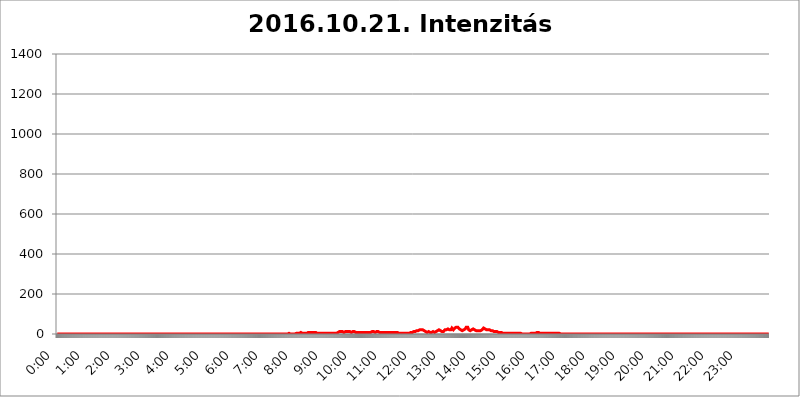
| Category | 2016.10.21. Intenzitás [W/m^2] |
|---|---|
| 0.0 | 0 |
| 0.0006944444444444445 | 0 |
| 0.001388888888888889 | 0 |
| 0.0020833333333333333 | 0 |
| 0.002777777777777778 | 0 |
| 0.003472222222222222 | 0 |
| 0.004166666666666667 | 0 |
| 0.004861111111111111 | 0 |
| 0.005555555555555556 | 0 |
| 0.0062499999999999995 | 0 |
| 0.006944444444444444 | 0 |
| 0.007638888888888889 | 0 |
| 0.008333333333333333 | 0 |
| 0.009027777777777779 | 0 |
| 0.009722222222222222 | 0 |
| 0.010416666666666666 | 0 |
| 0.011111111111111112 | 0 |
| 0.011805555555555555 | 0 |
| 0.012499999999999999 | 0 |
| 0.013194444444444444 | 0 |
| 0.013888888888888888 | 0 |
| 0.014583333333333332 | 0 |
| 0.015277777777777777 | 0 |
| 0.015972222222222224 | 0 |
| 0.016666666666666666 | 0 |
| 0.017361111111111112 | 0 |
| 0.018055555555555557 | 0 |
| 0.01875 | 0 |
| 0.019444444444444445 | 0 |
| 0.02013888888888889 | 0 |
| 0.020833333333333332 | 0 |
| 0.02152777777777778 | 0 |
| 0.022222222222222223 | 0 |
| 0.02291666666666667 | 0 |
| 0.02361111111111111 | 0 |
| 0.024305555555555556 | 0 |
| 0.024999999999999998 | 0 |
| 0.025694444444444447 | 0 |
| 0.02638888888888889 | 0 |
| 0.027083333333333334 | 0 |
| 0.027777777777777776 | 0 |
| 0.02847222222222222 | 0 |
| 0.029166666666666664 | 0 |
| 0.029861111111111113 | 0 |
| 0.030555555555555555 | 0 |
| 0.03125 | 0 |
| 0.03194444444444445 | 0 |
| 0.03263888888888889 | 0 |
| 0.03333333333333333 | 0 |
| 0.034027777777777775 | 0 |
| 0.034722222222222224 | 0 |
| 0.035416666666666666 | 0 |
| 0.036111111111111115 | 0 |
| 0.03680555555555556 | 0 |
| 0.0375 | 0 |
| 0.03819444444444444 | 0 |
| 0.03888888888888889 | 0 |
| 0.03958333333333333 | 0 |
| 0.04027777777777778 | 0 |
| 0.04097222222222222 | 0 |
| 0.041666666666666664 | 0 |
| 0.042361111111111106 | 0 |
| 0.04305555555555556 | 0 |
| 0.043750000000000004 | 0 |
| 0.044444444444444446 | 0 |
| 0.04513888888888889 | 0 |
| 0.04583333333333334 | 0 |
| 0.04652777777777778 | 0 |
| 0.04722222222222222 | 0 |
| 0.04791666666666666 | 0 |
| 0.04861111111111111 | 0 |
| 0.049305555555555554 | 0 |
| 0.049999999999999996 | 0 |
| 0.05069444444444445 | 0 |
| 0.051388888888888894 | 0 |
| 0.052083333333333336 | 0 |
| 0.05277777777777778 | 0 |
| 0.05347222222222222 | 0 |
| 0.05416666666666667 | 0 |
| 0.05486111111111111 | 0 |
| 0.05555555555555555 | 0 |
| 0.05625 | 0 |
| 0.05694444444444444 | 0 |
| 0.057638888888888885 | 0 |
| 0.05833333333333333 | 0 |
| 0.05902777777777778 | 0 |
| 0.059722222222222225 | 0 |
| 0.06041666666666667 | 0 |
| 0.061111111111111116 | 0 |
| 0.06180555555555556 | 0 |
| 0.0625 | 0 |
| 0.06319444444444444 | 0 |
| 0.06388888888888888 | 0 |
| 0.06458333333333334 | 0 |
| 0.06527777777777778 | 0 |
| 0.06597222222222222 | 0 |
| 0.06666666666666667 | 0 |
| 0.06736111111111111 | 0 |
| 0.06805555555555555 | 0 |
| 0.06874999999999999 | 0 |
| 0.06944444444444443 | 0 |
| 0.07013888888888889 | 0 |
| 0.07083333333333333 | 0 |
| 0.07152777777777779 | 0 |
| 0.07222222222222223 | 0 |
| 0.07291666666666667 | 0 |
| 0.07361111111111111 | 0 |
| 0.07430555555555556 | 0 |
| 0.075 | 0 |
| 0.07569444444444444 | 0 |
| 0.0763888888888889 | 0 |
| 0.07708333333333334 | 0 |
| 0.07777777777777778 | 0 |
| 0.07847222222222222 | 0 |
| 0.07916666666666666 | 0 |
| 0.0798611111111111 | 0 |
| 0.08055555555555556 | 0 |
| 0.08125 | 0 |
| 0.08194444444444444 | 0 |
| 0.08263888888888889 | 0 |
| 0.08333333333333333 | 0 |
| 0.08402777777777777 | 0 |
| 0.08472222222222221 | 0 |
| 0.08541666666666665 | 0 |
| 0.08611111111111112 | 0 |
| 0.08680555555555557 | 0 |
| 0.08750000000000001 | 0 |
| 0.08819444444444445 | 0 |
| 0.08888888888888889 | 0 |
| 0.08958333333333333 | 0 |
| 0.09027777777777778 | 0 |
| 0.09097222222222222 | 0 |
| 0.09166666666666667 | 0 |
| 0.09236111111111112 | 0 |
| 0.09305555555555556 | 0 |
| 0.09375 | 0 |
| 0.09444444444444444 | 0 |
| 0.09513888888888888 | 0 |
| 0.09583333333333333 | 0 |
| 0.09652777777777777 | 0 |
| 0.09722222222222222 | 0 |
| 0.09791666666666667 | 0 |
| 0.09861111111111111 | 0 |
| 0.09930555555555555 | 0 |
| 0.09999999999999999 | 0 |
| 0.10069444444444443 | 0 |
| 0.1013888888888889 | 0 |
| 0.10208333333333335 | 0 |
| 0.10277777777777779 | 0 |
| 0.10347222222222223 | 0 |
| 0.10416666666666667 | 0 |
| 0.10486111111111111 | 0 |
| 0.10555555555555556 | 0 |
| 0.10625 | 0 |
| 0.10694444444444444 | 0 |
| 0.1076388888888889 | 0 |
| 0.10833333333333334 | 0 |
| 0.10902777777777778 | 0 |
| 0.10972222222222222 | 0 |
| 0.1111111111111111 | 0 |
| 0.11180555555555556 | 0 |
| 0.11180555555555556 | 0 |
| 0.1125 | 0 |
| 0.11319444444444444 | 0 |
| 0.11388888888888889 | 0 |
| 0.11458333333333333 | 0 |
| 0.11527777777777777 | 0 |
| 0.11597222222222221 | 0 |
| 0.11666666666666665 | 0 |
| 0.1173611111111111 | 0 |
| 0.11805555555555557 | 0 |
| 0.11944444444444445 | 0 |
| 0.12013888888888889 | 0 |
| 0.12083333333333333 | 0 |
| 0.12152777777777778 | 0 |
| 0.12222222222222223 | 0 |
| 0.12291666666666667 | 0 |
| 0.12291666666666667 | 0 |
| 0.12361111111111112 | 0 |
| 0.12430555555555556 | 0 |
| 0.125 | 0 |
| 0.12569444444444444 | 0 |
| 0.12638888888888888 | 0 |
| 0.12708333333333333 | 0 |
| 0.16875 | 0 |
| 0.12847222222222224 | 0 |
| 0.12916666666666668 | 0 |
| 0.12986111111111112 | 0 |
| 0.13055555555555556 | 0 |
| 0.13125 | 0 |
| 0.13194444444444445 | 0 |
| 0.1326388888888889 | 0 |
| 0.13333333333333333 | 0 |
| 0.13402777777777777 | 0 |
| 0.13402777777777777 | 0 |
| 0.13472222222222222 | 0 |
| 0.13541666666666666 | 0 |
| 0.1361111111111111 | 0 |
| 0.13749999999999998 | 0 |
| 0.13819444444444443 | 0 |
| 0.1388888888888889 | 0 |
| 0.13958333333333334 | 0 |
| 0.14027777777777778 | 0 |
| 0.14097222222222222 | 0 |
| 0.14166666666666666 | 0 |
| 0.1423611111111111 | 0 |
| 0.14305555555555557 | 0 |
| 0.14375000000000002 | 0 |
| 0.14444444444444446 | 0 |
| 0.1451388888888889 | 0 |
| 0.1451388888888889 | 0 |
| 0.14652777777777778 | 0 |
| 0.14722222222222223 | 0 |
| 0.14791666666666667 | 0 |
| 0.1486111111111111 | 0 |
| 0.14930555555555555 | 0 |
| 0.15 | 0 |
| 0.15069444444444444 | 0 |
| 0.15138888888888888 | 0 |
| 0.15208333333333332 | 0 |
| 0.15277777777777776 | 0 |
| 0.15347222222222223 | 0 |
| 0.15416666666666667 | 0 |
| 0.15486111111111112 | 0 |
| 0.15555555555555556 | 0 |
| 0.15625 | 0 |
| 0.15694444444444444 | 0 |
| 0.15763888888888888 | 0 |
| 0.15833333333333333 | 0 |
| 0.15902777777777777 | 0 |
| 0.15972222222222224 | 0 |
| 0.16041666666666668 | 0 |
| 0.16111111111111112 | 0 |
| 0.16180555555555556 | 0 |
| 0.1625 | 0 |
| 0.16319444444444445 | 0 |
| 0.1638888888888889 | 0 |
| 0.16458333333333333 | 0 |
| 0.16527777777777777 | 0 |
| 0.16597222222222222 | 0 |
| 0.16666666666666666 | 0 |
| 0.1673611111111111 | 0 |
| 0.16805555555555554 | 0 |
| 0.16874999999999998 | 0 |
| 0.16944444444444443 | 0 |
| 0.17013888888888887 | 0 |
| 0.1708333333333333 | 0 |
| 0.17152777777777775 | 0 |
| 0.17222222222222225 | 0 |
| 0.1729166666666667 | 0 |
| 0.17361111111111113 | 0 |
| 0.17430555555555557 | 0 |
| 0.17500000000000002 | 0 |
| 0.17569444444444446 | 0 |
| 0.1763888888888889 | 0 |
| 0.17708333333333334 | 0 |
| 0.17777777777777778 | 0 |
| 0.17847222222222223 | 0 |
| 0.17916666666666667 | 0 |
| 0.1798611111111111 | 0 |
| 0.18055555555555555 | 0 |
| 0.18125 | 0 |
| 0.18194444444444444 | 0 |
| 0.1826388888888889 | 0 |
| 0.18333333333333335 | 0 |
| 0.1840277777777778 | 0 |
| 0.18472222222222223 | 0 |
| 0.18541666666666667 | 0 |
| 0.18611111111111112 | 0 |
| 0.18680555555555556 | 0 |
| 0.1875 | 0 |
| 0.18819444444444444 | 0 |
| 0.18888888888888888 | 0 |
| 0.18958333333333333 | 0 |
| 0.19027777777777777 | 0 |
| 0.1909722222222222 | 0 |
| 0.19166666666666665 | 0 |
| 0.19236111111111112 | 0 |
| 0.19305555555555554 | 0 |
| 0.19375 | 0 |
| 0.19444444444444445 | 0 |
| 0.1951388888888889 | 0 |
| 0.19583333333333333 | 0 |
| 0.19652777777777777 | 0 |
| 0.19722222222222222 | 0 |
| 0.19791666666666666 | 0 |
| 0.1986111111111111 | 0 |
| 0.19930555555555554 | 0 |
| 0.19999999999999998 | 0 |
| 0.20069444444444443 | 0 |
| 0.20138888888888887 | 0 |
| 0.2020833333333333 | 0 |
| 0.2027777777777778 | 0 |
| 0.2034722222222222 | 0 |
| 0.2041666666666667 | 0 |
| 0.20486111111111113 | 0 |
| 0.20555555555555557 | 0 |
| 0.20625000000000002 | 0 |
| 0.20694444444444446 | 0 |
| 0.2076388888888889 | 0 |
| 0.20833333333333334 | 0 |
| 0.20902777777777778 | 0 |
| 0.20972222222222223 | 0 |
| 0.21041666666666667 | 0 |
| 0.2111111111111111 | 0 |
| 0.21180555555555555 | 0 |
| 0.2125 | 0 |
| 0.21319444444444444 | 0 |
| 0.2138888888888889 | 0 |
| 0.21458333333333335 | 0 |
| 0.2152777777777778 | 0 |
| 0.21597222222222223 | 0 |
| 0.21666666666666667 | 0 |
| 0.21736111111111112 | 0 |
| 0.21805555555555556 | 0 |
| 0.21875 | 0 |
| 0.21944444444444444 | 0 |
| 0.22013888888888888 | 0 |
| 0.22083333333333333 | 0 |
| 0.22152777777777777 | 0 |
| 0.2222222222222222 | 0 |
| 0.22291666666666665 | 0 |
| 0.2236111111111111 | 0 |
| 0.22430555555555556 | 0 |
| 0.225 | 0 |
| 0.22569444444444445 | 0 |
| 0.2263888888888889 | 0 |
| 0.22708333333333333 | 0 |
| 0.22777777777777777 | 0 |
| 0.22847222222222222 | 0 |
| 0.22916666666666666 | 0 |
| 0.2298611111111111 | 0 |
| 0.23055555555555554 | 0 |
| 0.23124999999999998 | 0 |
| 0.23194444444444443 | 0 |
| 0.23263888888888887 | 0 |
| 0.2333333333333333 | 0 |
| 0.2340277777777778 | 0 |
| 0.2347222222222222 | 0 |
| 0.2354166666666667 | 0 |
| 0.23611111111111113 | 0 |
| 0.23680555555555557 | 0 |
| 0.23750000000000002 | 0 |
| 0.23819444444444446 | 0 |
| 0.2388888888888889 | 0 |
| 0.23958333333333334 | 0 |
| 0.24027777777777778 | 0 |
| 0.24097222222222223 | 0 |
| 0.24166666666666667 | 0 |
| 0.2423611111111111 | 0 |
| 0.24305555555555555 | 0 |
| 0.24375 | 0 |
| 0.24444444444444446 | 0 |
| 0.24513888888888888 | 0 |
| 0.24583333333333335 | 0 |
| 0.2465277777777778 | 0 |
| 0.24722222222222223 | 0 |
| 0.24791666666666667 | 0 |
| 0.24861111111111112 | 0 |
| 0.24930555555555556 | 0 |
| 0.25 | 0 |
| 0.25069444444444444 | 0 |
| 0.2513888888888889 | 0 |
| 0.2520833333333333 | 0 |
| 0.25277777777777777 | 0 |
| 0.2534722222222222 | 0 |
| 0.25416666666666665 | 0 |
| 0.2548611111111111 | 0 |
| 0.2555555555555556 | 0 |
| 0.25625000000000003 | 0 |
| 0.2569444444444445 | 0 |
| 0.2576388888888889 | 0 |
| 0.25833333333333336 | 0 |
| 0.2590277777777778 | 0 |
| 0.25972222222222224 | 0 |
| 0.2604166666666667 | 0 |
| 0.2611111111111111 | 0 |
| 0.26180555555555557 | 0 |
| 0.2625 | 0 |
| 0.26319444444444445 | 0 |
| 0.2638888888888889 | 0 |
| 0.26458333333333334 | 0 |
| 0.2652777777777778 | 0 |
| 0.2659722222222222 | 0 |
| 0.26666666666666666 | 0 |
| 0.2673611111111111 | 0 |
| 0.26805555555555555 | 0 |
| 0.26875 | 0 |
| 0.26944444444444443 | 0 |
| 0.2701388888888889 | 0 |
| 0.2708333333333333 | 0 |
| 0.27152777777777776 | 0 |
| 0.2722222222222222 | 0 |
| 0.27291666666666664 | 0 |
| 0.2736111111111111 | 0 |
| 0.2743055555555555 | 0 |
| 0.27499999999999997 | 0 |
| 0.27569444444444446 | 0 |
| 0.27638888888888885 | 0 |
| 0.27708333333333335 | 0 |
| 0.2777777777777778 | 0 |
| 0.27847222222222223 | 0 |
| 0.2791666666666667 | 0 |
| 0.2798611111111111 | 0 |
| 0.28055555555555556 | 0 |
| 0.28125 | 0 |
| 0.28194444444444444 | 0 |
| 0.2826388888888889 | 0 |
| 0.2833333333333333 | 0 |
| 0.28402777777777777 | 0 |
| 0.2847222222222222 | 0 |
| 0.28541666666666665 | 0 |
| 0.28611111111111115 | 0 |
| 0.28680555555555554 | 0 |
| 0.28750000000000003 | 0 |
| 0.2881944444444445 | 0 |
| 0.2888888888888889 | 0 |
| 0.28958333333333336 | 0 |
| 0.2902777777777778 | 0 |
| 0.29097222222222224 | 0 |
| 0.2916666666666667 | 0 |
| 0.2923611111111111 | 0 |
| 0.29305555555555557 | 0 |
| 0.29375 | 0 |
| 0.29444444444444445 | 0 |
| 0.2951388888888889 | 0 |
| 0.29583333333333334 | 0 |
| 0.2965277777777778 | 0 |
| 0.2972222222222222 | 0 |
| 0.29791666666666666 | 0 |
| 0.2986111111111111 | 0 |
| 0.29930555555555555 | 0 |
| 0.3 | 0 |
| 0.30069444444444443 | 0 |
| 0.3013888888888889 | 0 |
| 0.3020833333333333 | 0 |
| 0.30277777777777776 | 0 |
| 0.3034722222222222 | 0 |
| 0.30416666666666664 | 0 |
| 0.3048611111111111 | 0 |
| 0.3055555555555555 | 0 |
| 0.30624999999999997 | 0 |
| 0.3069444444444444 | 0 |
| 0.3076388888888889 | 0 |
| 0.30833333333333335 | 0 |
| 0.3090277777777778 | 0 |
| 0.30972222222222223 | 0 |
| 0.3104166666666667 | 0 |
| 0.3111111111111111 | 0 |
| 0.31180555555555556 | 0 |
| 0.3125 | 0 |
| 0.31319444444444444 | 0 |
| 0.3138888888888889 | 0 |
| 0.3145833333333333 | 0 |
| 0.31527777777777777 | 0 |
| 0.3159722222222222 | 0 |
| 0.31666666666666665 | 0 |
| 0.31736111111111115 | 0 |
| 0.31805555555555554 | 0 |
| 0.31875000000000003 | 0 |
| 0.3194444444444445 | 0 |
| 0.3201388888888889 | 0 |
| 0.32083333333333336 | 0 |
| 0.3215277777777778 | 0 |
| 0.32222222222222224 | 0 |
| 0.3229166666666667 | 0 |
| 0.3236111111111111 | 3.525 |
| 0.32430555555555557 | 3.525 |
| 0.325 | 3.525 |
| 0.32569444444444445 | 3.525 |
| 0.3263888888888889 | 0 |
| 0.32708333333333334 | 0 |
| 0.3277777777777778 | 0 |
| 0.3284722222222222 | 0 |
| 0.32916666666666666 | 0 |
| 0.3298611111111111 | 0 |
| 0.33055555555555555 | 0 |
| 0.33125 | 0 |
| 0.33194444444444443 | 0 |
| 0.3326388888888889 | 0 |
| 0.3333333333333333 | 0 |
| 0.3340277777777778 | 0 |
| 0.3347222222222222 | 3.525 |
| 0.3354166666666667 | 3.525 |
| 0.3361111111111111 | 3.525 |
| 0.3368055555555556 | 3.525 |
| 0.33749999999999997 | 3.525 |
| 0.33819444444444446 | 3.525 |
| 0.33888888888888885 | 3.525 |
| 0.33958333333333335 | 3.525 |
| 0.34027777777777773 | 7.887 |
| 0.34097222222222223 | 7.887 |
| 0.3416666666666666 | 7.887 |
| 0.3423611111111111 | 7.887 |
| 0.3430555555555555 | 7.887 |
| 0.34375 | 3.525 |
| 0.3444444444444445 | 3.525 |
| 0.3451388888888889 | 3.525 |
| 0.3458333333333334 | 3.525 |
| 0.34652777777777777 | 3.525 |
| 0.34722222222222227 | 3.525 |
| 0.34791666666666665 | 3.525 |
| 0.34861111111111115 | 3.525 |
| 0.34930555555555554 | 3.525 |
| 0.35000000000000003 | 3.525 |
| 0.3506944444444444 | 3.525 |
| 0.3513888888888889 | 3.525 |
| 0.3520833333333333 | 7.887 |
| 0.3527777777777778 | 7.887 |
| 0.3534722222222222 | 3.525 |
| 0.3541666666666667 | 7.887 |
| 0.3548611111111111 | 7.887 |
| 0.35555555555555557 | 7.887 |
| 0.35625 | 7.887 |
| 0.35694444444444445 | 7.887 |
| 0.3576388888888889 | 7.887 |
| 0.35833333333333334 | 7.887 |
| 0.3590277777777778 | 7.887 |
| 0.3597222222222222 | 7.887 |
| 0.36041666666666666 | 7.887 |
| 0.3611111111111111 | 7.887 |
| 0.36180555555555555 | 7.887 |
| 0.3625 | 7.887 |
| 0.36319444444444443 | 3.525 |
| 0.3638888888888889 | 3.525 |
| 0.3645833333333333 | 3.525 |
| 0.3652777777777778 | 3.525 |
| 0.3659722222222222 | 3.525 |
| 0.3666666666666667 | 3.525 |
| 0.3673611111111111 | 3.525 |
| 0.3680555555555556 | 3.525 |
| 0.36874999999999997 | 3.525 |
| 0.36944444444444446 | 3.525 |
| 0.37013888888888885 | 3.525 |
| 0.37083333333333335 | 3.525 |
| 0.37152777777777773 | 3.525 |
| 0.37222222222222223 | 3.525 |
| 0.3729166666666666 | 3.525 |
| 0.3736111111111111 | 3.525 |
| 0.3743055555555555 | 3.525 |
| 0.375 | 3.525 |
| 0.3756944444444445 | 3.525 |
| 0.3763888888888889 | 3.525 |
| 0.3770833333333334 | 3.525 |
| 0.37777777777777777 | 3.525 |
| 0.37847222222222227 | 3.525 |
| 0.37916666666666665 | 3.525 |
| 0.37986111111111115 | 3.525 |
| 0.38055555555555554 | 3.525 |
| 0.38125000000000003 | 3.525 |
| 0.3819444444444444 | 3.525 |
| 0.3826388888888889 | 3.525 |
| 0.3833333333333333 | 3.525 |
| 0.3840277777777778 | 3.525 |
| 0.3847222222222222 | 3.525 |
| 0.3854166666666667 | 3.525 |
| 0.3861111111111111 | 3.525 |
| 0.38680555555555557 | 3.525 |
| 0.3875 | 3.525 |
| 0.38819444444444445 | 3.525 |
| 0.3888888888888889 | 3.525 |
| 0.38958333333333334 | 3.525 |
| 0.3902777777777778 | 3.525 |
| 0.3909722222222222 | 3.525 |
| 0.39166666666666666 | 3.525 |
| 0.3923611111111111 | 3.525 |
| 0.39305555555555555 | 7.887 |
| 0.39375 | 7.887 |
| 0.39444444444444443 | 7.887 |
| 0.3951388888888889 | 7.887 |
| 0.3958333333333333 | 12.257 |
| 0.3965277777777778 | 12.257 |
| 0.3972222222222222 | 12.257 |
| 0.3979166666666667 | 12.257 |
| 0.3986111111111111 | 12.257 |
| 0.3993055555555556 | 12.257 |
| 0.39999999999999997 | 12.257 |
| 0.40069444444444446 | 7.887 |
| 0.40138888888888885 | 7.887 |
| 0.40208333333333335 | 7.887 |
| 0.40277777777777773 | 7.887 |
| 0.40347222222222223 | 12.257 |
| 0.4041666666666666 | 12.257 |
| 0.4048611111111111 | 12.257 |
| 0.4055555555555555 | 12.257 |
| 0.40625 | 12.257 |
| 0.4069444444444445 | 12.257 |
| 0.4076388888888889 | 12.257 |
| 0.4083333333333334 | 12.257 |
| 0.40902777777777777 | 12.257 |
| 0.40972222222222227 | 12.257 |
| 0.41041666666666665 | 12.257 |
| 0.41111111111111115 | 7.887 |
| 0.41180555555555554 | 7.887 |
| 0.41250000000000003 | 7.887 |
| 0.4131944444444444 | 7.887 |
| 0.4138888888888889 | 12.257 |
| 0.4145833333333333 | 12.257 |
| 0.4152777777777778 | 12.257 |
| 0.4159722222222222 | 12.257 |
| 0.4166666666666667 | 12.257 |
| 0.4173611111111111 | 12.257 |
| 0.41805555555555557 | 12.257 |
| 0.41875 | 7.887 |
| 0.41944444444444445 | 7.887 |
| 0.4201388888888889 | 7.887 |
| 0.42083333333333334 | 7.887 |
| 0.4215277777777778 | 7.887 |
| 0.4222222222222222 | 7.887 |
| 0.42291666666666666 | 7.887 |
| 0.4236111111111111 | 7.887 |
| 0.42430555555555555 | 7.887 |
| 0.425 | 7.887 |
| 0.42569444444444443 | 7.887 |
| 0.4263888888888889 | 7.887 |
| 0.4270833333333333 | 7.887 |
| 0.4277777777777778 | 7.887 |
| 0.4284722222222222 | 7.887 |
| 0.4291666666666667 | 7.887 |
| 0.4298611111111111 | 7.887 |
| 0.4305555555555556 | 7.887 |
| 0.43124999999999997 | 7.887 |
| 0.43194444444444446 | 7.887 |
| 0.43263888888888885 | 7.887 |
| 0.43333333333333335 | 7.887 |
| 0.43402777777777773 | 7.887 |
| 0.43472222222222223 | 7.887 |
| 0.4354166666666666 | 7.887 |
| 0.4361111111111111 | 7.887 |
| 0.4368055555555555 | 7.887 |
| 0.4375 | 7.887 |
| 0.4381944444444445 | 7.887 |
| 0.4388888888888889 | 7.887 |
| 0.4395833333333334 | 7.887 |
| 0.44027777777777777 | 12.257 |
| 0.44097222222222227 | 12.257 |
| 0.44166666666666665 | 12.257 |
| 0.44236111111111115 | 12.257 |
| 0.44305555555555554 | 12.257 |
| 0.44375000000000003 | 12.257 |
| 0.4444444444444444 | 12.257 |
| 0.4451388888888889 | 7.887 |
| 0.4458333333333333 | 7.887 |
| 0.4465277777777778 | 7.887 |
| 0.4472222222222222 | 7.887 |
| 0.4479166666666667 | 12.257 |
| 0.4486111111111111 | 12.257 |
| 0.44930555555555557 | 12.257 |
| 0.45 | 12.257 |
| 0.45069444444444445 | 7.887 |
| 0.4513888888888889 | 12.257 |
| 0.45208333333333334 | 7.887 |
| 0.4527777777777778 | 7.887 |
| 0.4534722222222222 | 7.887 |
| 0.45416666666666666 | 7.887 |
| 0.4548611111111111 | 7.887 |
| 0.45555555555555555 | 7.887 |
| 0.45625 | 7.887 |
| 0.45694444444444443 | 7.887 |
| 0.4576388888888889 | 7.887 |
| 0.4583333333333333 | 7.887 |
| 0.4590277777777778 | 7.887 |
| 0.4597222222222222 | 7.887 |
| 0.4604166666666667 | 7.887 |
| 0.4611111111111111 | 7.887 |
| 0.4618055555555556 | 7.887 |
| 0.46249999999999997 | 7.887 |
| 0.46319444444444446 | 7.887 |
| 0.46388888888888885 | 7.887 |
| 0.46458333333333335 | 7.887 |
| 0.46527777777777773 | 7.887 |
| 0.46597222222222223 | 7.887 |
| 0.4666666666666666 | 7.887 |
| 0.4673611111111111 | 7.887 |
| 0.4680555555555555 | 7.887 |
| 0.46875 | 7.887 |
| 0.4694444444444445 | 7.887 |
| 0.4701388888888889 | 7.887 |
| 0.4708333333333334 | 7.887 |
| 0.47152777777777777 | 7.887 |
| 0.47222222222222227 | 7.887 |
| 0.47291666666666665 | 7.887 |
| 0.47361111111111115 | 7.887 |
| 0.47430555555555554 | 7.887 |
| 0.47500000000000003 | 7.887 |
| 0.4756944444444444 | 7.887 |
| 0.4763888888888889 | 7.887 |
| 0.4770833333333333 | 7.887 |
| 0.4777777777777778 | 7.887 |
| 0.4784722222222222 | 7.887 |
| 0.4791666666666667 | 3.525 |
| 0.4798611111111111 | 3.525 |
| 0.48055555555555557 | 3.525 |
| 0.48125 | 3.525 |
| 0.48194444444444445 | 3.525 |
| 0.4826388888888889 | 3.525 |
| 0.48333333333333334 | 3.525 |
| 0.4840277777777778 | 3.525 |
| 0.4847222222222222 | 3.525 |
| 0.48541666666666666 | 3.525 |
| 0.4861111111111111 | 3.525 |
| 0.48680555555555555 | 3.525 |
| 0.4875 | 3.525 |
| 0.48819444444444443 | 3.525 |
| 0.4888888888888889 | 3.525 |
| 0.4895833333333333 | 3.525 |
| 0.4902777777777778 | 3.525 |
| 0.4909722222222222 | 3.525 |
| 0.4916666666666667 | 3.525 |
| 0.4923611111111111 | 3.525 |
| 0.4930555555555556 | 3.525 |
| 0.49374999999999997 | 3.525 |
| 0.49444444444444446 | 7.887 |
| 0.49513888888888885 | 7.887 |
| 0.49583333333333335 | 7.887 |
| 0.49652777777777773 | 7.887 |
| 0.49722222222222223 | 7.887 |
| 0.4979166666666666 | 7.887 |
| 0.4986111111111111 | 7.887 |
| 0.4993055555555555 | 7.887 |
| 0.5 | 12.257 |
| 0.5006944444444444 | 12.257 |
| 0.5013888888888889 | 12.257 |
| 0.5020833333333333 | 12.257 |
| 0.5027777777777778 | 12.257 |
| 0.5034722222222222 | 12.257 |
| 0.5041666666666667 | 16.636 |
| 0.5048611111111111 | 16.636 |
| 0.5055555555555555 | 16.636 |
| 0.50625 | 16.636 |
| 0.5069444444444444 | 16.636 |
| 0.5076388888888889 | 21.024 |
| 0.5083333333333333 | 21.024 |
| 0.5090277777777777 | 21.024 |
| 0.5097222222222222 | 21.024 |
| 0.5104166666666666 | 21.024 |
| 0.5111111111111112 | 21.024 |
| 0.5118055555555555 | 21.024 |
| 0.5125000000000001 | 21.024 |
| 0.5131944444444444 | 21.024 |
| 0.513888888888889 | 21.024 |
| 0.5145833333333333 | 16.636 |
| 0.5152777777777778 | 16.636 |
| 0.5159722222222222 | 12.257 |
| 0.5166666666666667 | 12.257 |
| 0.517361111111111 | 12.257 |
| 0.5180555555555556 | 12.257 |
| 0.5187499999999999 | 7.887 |
| 0.5194444444444445 | 7.887 |
| 0.5201388888888888 | 7.887 |
| 0.5208333333333334 | 12.257 |
| 0.5215277777777778 | 12.257 |
| 0.5222222222222223 | 7.887 |
| 0.5229166666666667 | 7.887 |
| 0.5236111111111111 | 7.887 |
| 0.5243055555555556 | 7.887 |
| 0.525 | 7.887 |
| 0.5256944444444445 | 12.257 |
| 0.5263888888888889 | 12.257 |
| 0.5270833333333333 | 12.257 |
| 0.5277777777777778 | 7.887 |
| 0.5284722222222222 | 7.887 |
| 0.5291666666666667 | 7.887 |
| 0.5298611111111111 | 12.257 |
| 0.5305555555555556 | 12.257 |
| 0.53125 | 12.257 |
| 0.5319444444444444 | 12.257 |
| 0.5326388888888889 | 12.257 |
| 0.5333333333333333 | 16.636 |
| 0.5340277777777778 | 16.636 |
| 0.5347222222222222 | 16.636 |
| 0.5354166666666667 | 21.024 |
| 0.5361111111111111 | 21.024 |
| 0.5368055555555555 | 16.636 |
| 0.5375 | 16.636 |
| 0.5381944444444444 | 12.257 |
| 0.5388888888888889 | 12.257 |
| 0.5395833333333333 | 12.257 |
| 0.5402777777777777 | 12.257 |
| 0.5409722222222222 | 12.257 |
| 0.5416666666666666 | 12.257 |
| 0.5423611111111112 | 12.257 |
| 0.5430555555555555 | 16.636 |
| 0.5437500000000001 | 21.024 |
| 0.5444444444444444 | 21.024 |
| 0.545138888888889 | 21.024 |
| 0.5458333333333333 | 21.024 |
| 0.5465277777777778 | 21.024 |
| 0.5472222222222222 | 21.024 |
| 0.5479166666666667 | 25.419 |
| 0.548611111111111 | 29.823 |
| 0.5493055555555556 | 25.419 |
| 0.5499999999999999 | 21.024 |
| 0.5506944444444445 | 21.024 |
| 0.5513888888888888 | 21.024 |
| 0.5520833333333334 | 21.024 |
| 0.5527777777777778 | 25.419 |
| 0.5534722222222223 | 29.823 |
| 0.5541666666666667 | 29.823 |
| 0.5548611111111111 | 25.419 |
| 0.5555555555555556 | 21.024 |
| 0.55625 | 21.024 |
| 0.5569444444444445 | 25.419 |
| 0.5576388888888889 | 29.823 |
| 0.5583333333333333 | 34.234 |
| 0.5590277777777778 | 34.234 |
| 0.5597222222222222 | 34.234 |
| 0.5604166666666667 | 34.234 |
| 0.5611111111111111 | 34.234 |
| 0.5618055555555556 | 34.234 |
| 0.5625 | 29.823 |
| 0.5631944444444444 | 29.823 |
| 0.5638888888888889 | 25.419 |
| 0.5645833333333333 | 25.419 |
| 0.5652777777777778 | 25.419 |
| 0.5659722222222222 | 21.024 |
| 0.5666666666666667 | 16.636 |
| 0.5673611111111111 | 16.636 |
| 0.5680555555555555 | 16.636 |
| 0.56875 | 16.636 |
| 0.5694444444444444 | 21.024 |
| 0.5701388888888889 | 21.024 |
| 0.5708333333333333 | 21.024 |
| 0.5715277777777777 | 25.419 |
| 0.5722222222222222 | 25.419 |
| 0.5729166666666666 | 29.823 |
| 0.5736111111111112 | 34.234 |
| 0.5743055555555555 | 38.653 |
| 0.5750000000000001 | 38.653 |
| 0.5756944444444444 | 34.234 |
| 0.576388888888889 | 29.823 |
| 0.5770833333333333 | 21.024 |
| 0.5777777777777778 | 21.024 |
| 0.5784722222222222 | 16.636 |
| 0.5791666666666667 | 16.636 |
| 0.579861111111111 | 16.636 |
| 0.5805555555555556 | 16.636 |
| 0.5812499999999999 | 21.024 |
| 0.5819444444444445 | 21.024 |
| 0.5826388888888888 | 21.024 |
| 0.5833333333333334 | 25.419 |
| 0.5840277777777778 | 25.419 |
| 0.5847222222222223 | 21.024 |
| 0.5854166666666667 | 21.024 |
| 0.5861111111111111 | 21.024 |
| 0.5868055555555556 | 21.024 |
| 0.5875 | 16.636 |
| 0.5881944444444445 | 16.636 |
| 0.5888888888888889 | 16.636 |
| 0.5895833333333333 | 16.636 |
| 0.5902777777777778 | 16.636 |
| 0.5909722222222222 | 16.636 |
| 0.5916666666666667 | 16.636 |
| 0.5923611111111111 | 16.636 |
| 0.5930555555555556 | 16.636 |
| 0.59375 | 16.636 |
| 0.5944444444444444 | 21.024 |
| 0.5951388888888889 | 21.024 |
| 0.5958333333333333 | 21.024 |
| 0.5965277777777778 | 25.419 |
| 0.5972222222222222 | 25.419 |
| 0.5979166666666667 | 29.823 |
| 0.5986111111111111 | 29.823 |
| 0.5993055555555555 | 29.823 |
| 0.6 | 25.419 |
| 0.6006944444444444 | 25.419 |
| 0.6013888888888889 | 21.024 |
| 0.6020833333333333 | 21.024 |
| 0.6027777777777777 | 21.024 |
| 0.6034722222222222 | 21.024 |
| 0.6041666666666666 | 21.024 |
| 0.6048611111111112 | 21.024 |
| 0.6055555555555555 | 21.024 |
| 0.6062500000000001 | 21.024 |
| 0.6069444444444444 | 21.024 |
| 0.607638888888889 | 16.636 |
| 0.6083333333333333 | 16.636 |
| 0.6090277777777778 | 16.636 |
| 0.6097222222222222 | 16.636 |
| 0.6104166666666667 | 16.636 |
| 0.611111111111111 | 12.257 |
| 0.6118055555555556 | 12.257 |
| 0.6124999999999999 | 12.257 |
| 0.6131944444444445 | 12.257 |
| 0.6138888888888888 | 7.887 |
| 0.6145833333333334 | 12.257 |
| 0.6152777777777778 | 12.257 |
| 0.6159722222222223 | 12.257 |
| 0.6166666666666667 | 12.257 |
| 0.6173611111111111 | 7.887 |
| 0.6180555555555556 | 7.887 |
| 0.61875 | 7.887 |
| 0.6194444444444445 | 7.887 |
| 0.6201388888888889 | 7.887 |
| 0.6208333333333333 | 7.887 |
| 0.6215277777777778 | 3.525 |
| 0.6222222222222222 | 7.887 |
| 0.6229166666666667 | 7.887 |
| 0.6236111111111111 | 7.887 |
| 0.6243055555555556 | 3.525 |
| 0.625 | 3.525 |
| 0.6256944444444444 | 3.525 |
| 0.6263888888888889 | 3.525 |
| 0.6270833333333333 | 3.525 |
| 0.6277777777777778 | 3.525 |
| 0.6284722222222222 | 3.525 |
| 0.6291666666666667 | 3.525 |
| 0.6298611111111111 | 3.525 |
| 0.6305555555555555 | 3.525 |
| 0.63125 | 3.525 |
| 0.6319444444444444 | 3.525 |
| 0.6326388888888889 | 3.525 |
| 0.6333333333333333 | 3.525 |
| 0.6340277777777777 | 3.525 |
| 0.6347222222222222 | 3.525 |
| 0.6354166666666666 | 3.525 |
| 0.6361111111111112 | 3.525 |
| 0.6368055555555555 | 3.525 |
| 0.6375000000000001 | 3.525 |
| 0.6381944444444444 | 3.525 |
| 0.638888888888889 | 3.525 |
| 0.6395833333333333 | 3.525 |
| 0.6402777777777778 | 0 |
| 0.6409722222222222 | 3.525 |
| 0.6416666666666667 | 3.525 |
| 0.642361111111111 | 3.525 |
| 0.6430555555555556 | 3.525 |
| 0.6437499999999999 | 3.525 |
| 0.6444444444444445 | 3.525 |
| 0.6451388888888888 | 3.525 |
| 0.6458333333333334 | 3.525 |
| 0.6465277777777778 | 3.525 |
| 0.6472222222222223 | 3.525 |
| 0.6479166666666667 | 3.525 |
| 0.6486111111111111 | 3.525 |
| 0.6493055555555556 | 3.525 |
| 0.65 | 3.525 |
| 0.6506944444444445 | 3.525 |
| 0.6513888888888889 | 0 |
| 0.6520833333333333 | 0 |
| 0.6527777777777778 | 0 |
| 0.6534722222222222 | 0 |
| 0.6541666666666667 | 0 |
| 0.6548611111111111 | 0 |
| 0.6555555555555556 | 0 |
| 0.65625 | 0 |
| 0.6569444444444444 | 0 |
| 0.6576388888888889 | 0 |
| 0.6583333333333333 | 0 |
| 0.6590277777777778 | 0 |
| 0.6597222222222222 | 0 |
| 0.6604166666666667 | 0 |
| 0.6611111111111111 | 0 |
| 0.6618055555555555 | 0 |
| 0.6625 | 0 |
| 0.6631944444444444 | 3.525 |
| 0.6638888888888889 | 0 |
| 0.6645833333333333 | 3.525 |
| 0.6652777777777777 | 3.525 |
| 0.6659722222222222 | 3.525 |
| 0.6666666666666666 | 3.525 |
| 0.6673611111111111 | 3.525 |
| 0.6680555555555556 | 3.525 |
| 0.6687500000000001 | 3.525 |
| 0.6694444444444444 | 3.525 |
| 0.6701388888888888 | 3.525 |
| 0.6708333333333334 | 3.525 |
| 0.6715277777777778 | 7.887 |
| 0.6722222222222222 | 7.887 |
| 0.6729166666666666 | 7.887 |
| 0.6736111111111112 | 7.887 |
| 0.6743055555555556 | 7.887 |
| 0.6749999999999999 | 7.887 |
| 0.6756944444444444 | 3.525 |
| 0.6763888888888889 | 3.525 |
| 0.6770833333333334 | 3.525 |
| 0.6777777777777777 | 3.525 |
| 0.6784722222222223 | 3.525 |
| 0.6791666666666667 | 3.525 |
| 0.6798611111111111 | 7.887 |
| 0.6805555555555555 | 3.525 |
| 0.68125 | 3.525 |
| 0.6819444444444445 | 3.525 |
| 0.6826388888888889 | 3.525 |
| 0.6833333333333332 | 3.525 |
| 0.6840277777777778 | 3.525 |
| 0.6847222222222222 | 3.525 |
| 0.6854166666666667 | 3.525 |
| 0.686111111111111 | 3.525 |
| 0.6868055555555556 | 3.525 |
| 0.6875 | 3.525 |
| 0.6881944444444444 | 3.525 |
| 0.688888888888889 | 3.525 |
| 0.6895833333333333 | 3.525 |
| 0.6902777777777778 | 0 |
| 0.6909722222222222 | 0 |
| 0.6916666666666668 | 3.525 |
| 0.6923611111111111 | 3.525 |
| 0.6930555555555555 | 3.525 |
| 0.69375 | 3.525 |
| 0.6944444444444445 | 3.525 |
| 0.6951388888888889 | 3.525 |
| 0.6958333333333333 | 3.525 |
| 0.6965277777777777 | 3.525 |
| 0.6972222222222223 | 3.525 |
| 0.6979166666666666 | 3.525 |
| 0.6986111111111111 | 3.525 |
| 0.6993055555555556 | 3.525 |
| 0.7000000000000001 | 3.525 |
| 0.7006944444444444 | 3.525 |
| 0.7013888888888888 | 0 |
| 0.7020833333333334 | 3.525 |
| 0.7027777777777778 | 3.525 |
| 0.7034722222222222 | 3.525 |
| 0.7041666666666666 | 3.525 |
| 0.7048611111111112 | 3.525 |
| 0.7055555555555556 | 0 |
| 0.7062499999999999 | 0 |
| 0.7069444444444444 | 0 |
| 0.7076388888888889 | 0 |
| 0.7083333333333334 | 0 |
| 0.7090277777777777 | 0 |
| 0.7097222222222223 | 0 |
| 0.7104166666666667 | 0 |
| 0.7111111111111111 | 0 |
| 0.7118055555555555 | 0 |
| 0.7125 | 0 |
| 0.7131944444444445 | 0 |
| 0.7138888888888889 | 0 |
| 0.7145833333333332 | 0 |
| 0.7152777777777778 | 0 |
| 0.7159722222222222 | 0 |
| 0.7166666666666667 | 0 |
| 0.717361111111111 | 0 |
| 0.7180555555555556 | 0 |
| 0.71875 | 0 |
| 0.7194444444444444 | 0 |
| 0.720138888888889 | 0 |
| 0.7208333333333333 | 0 |
| 0.7215277777777778 | 0 |
| 0.7222222222222222 | 0 |
| 0.7229166666666668 | 0 |
| 0.7236111111111111 | 0 |
| 0.7243055555555555 | 0 |
| 0.725 | 0 |
| 0.7256944444444445 | 0 |
| 0.7263888888888889 | 0 |
| 0.7270833333333333 | 0 |
| 0.7277777777777777 | 0 |
| 0.7284722222222223 | 0 |
| 0.7291666666666666 | 0 |
| 0.7298611111111111 | 0 |
| 0.7305555555555556 | 0 |
| 0.7312500000000001 | 0 |
| 0.7319444444444444 | 0 |
| 0.7326388888888888 | 0 |
| 0.7333333333333334 | 0 |
| 0.7340277777777778 | 0 |
| 0.7347222222222222 | 0 |
| 0.7354166666666666 | 0 |
| 0.7361111111111112 | 0 |
| 0.7368055555555556 | 0 |
| 0.7374999999999999 | 0 |
| 0.7381944444444444 | 0 |
| 0.7388888888888889 | 0 |
| 0.7395833333333334 | 0 |
| 0.7402777777777777 | 0 |
| 0.7409722222222223 | 0 |
| 0.7416666666666667 | 0 |
| 0.7423611111111111 | 0 |
| 0.7430555555555555 | 0 |
| 0.74375 | 0 |
| 0.7444444444444445 | 0 |
| 0.7451388888888889 | 0 |
| 0.7458333333333332 | 0 |
| 0.7465277777777778 | 0 |
| 0.7472222222222222 | 0 |
| 0.7479166666666667 | 0 |
| 0.748611111111111 | 0 |
| 0.7493055555555556 | 0 |
| 0.75 | 0 |
| 0.7506944444444444 | 0 |
| 0.751388888888889 | 0 |
| 0.7520833333333333 | 0 |
| 0.7527777777777778 | 0 |
| 0.7534722222222222 | 0 |
| 0.7541666666666668 | 0 |
| 0.7548611111111111 | 0 |
| 0.7555555555555555 | 0 |
| 0.75625 | 0 |
| 0.7569444444444445 | 0 |
| 0.7576388888888889 | 0 |
| 0.7583333333333333 | 0 |
| 0.7590277777777777 | 0 |
| 0.7597222222222223 | 0 |
| 0.7604166666666666 | 0 |
| 0.7611111111111111 | 0 |
| 0.7618055555555556 | 0 |
| 0.7625000000000001 | 0 |
| 0.7631944444444444 | 0 |
| 0.7638888888888888 | 0 |
| 0.7645833333333334 | 0 |
| 0.7652777777777778 | 0 |
| 0.7659722222222222 | 0 |
| 0.7666666666666666 | 0 |
| 0.7673611111111112 | 0 |
| 0.7680555555555556 | 0 |
| 0.7687499999999999 | 0 |
| 0.7694444444444444 | 0 |
| 0.7701388888888889 | 0 |
| 0.7708333333333334 | 0 |
| 0.7715277777777777 | 0 |
| 0.7722222222222223 | 0 |
| 0.7729166666666667 | 0 |
| 0.7736111111111111 | 0 |
| 0.7743055555555555 | 0 |
| 0.775 | 0 |
| 0.7756944444444445 | 0 |
| 0.7763888888888889 | 0 |
| 0.7770833333333332 | 0 |
| 0.7777777777777778 | 0 |
| 0.7784722222222222 | 0 |
| 0.7791666666666667 | 0 |
| 0.779861111111111 | 0 |
| 0.7805555555555556 | 0 |
| 0.78125 | 0 |
| 0.7819444444444444 | 0 |
| 0.782638888888889 | 0 |
| 0.7833333333333333 | 0 |
| 0.7840277777777778 | 0 |
| 0.7847222222222222 | 0 |
| 0.7854166666666668 | 0 |
| 0.7861111111111111 | 0 |
| 0.7868055555555555 | 0 |
| 0.7875 | 0 |
| 0.7881944444444445 | 0 |
| 0.7888888888888889 | 0 |
| 0.7895833333333333 | 0 |
| 0.7902777777777777 | 0 |
| 0.7909722222222223 | 0 |
| 0.7916666666666666 | 0 |
| 0.7923611111111111 | 0 |
| 0.7930555555555556 | 0 |
| 0.7937500000000001 | 0 |
| 0.7944444444444444 | 0 |
| 0.7951388888888888 | 0 |
| 0.7958333333333334 | 0 |
| 0.7965277777777778 | 0 |
| 0.7972222222222222 | 0 |
| 0.7979166666666666 | 0 |
| 0.7986111111111112 | 0 |
| 0.7993055555555556 | 0 |
| 0.7999999999999999 | 0 |
| 0.8006944444444444 | 0 |
| 0.8013888888888889 | 0 |
| 0.8020833333333334 | 0 |
| 0.8027777777777777 | 0 |
| 0.8034722222222223 | 0 |
| 0.8041666666666667 | 0 |
| 0.8048611111111111 | 0 |
| 0.8055555555555555 | 0 |
| 0.80625 | 0 |
| 0.8069444444444445 | 0 |
| 0.8076388888888889 | 0 |
| 0.8083333333333332 | 0 |
| 0.8090277777777778 | 0 |
| 0.8097222222222222 | 0 |
| 0.8104166666666667 | 0 |
| 0.811111111111111 | 0 |
| 0.8118055555555556 | 0 |
| 0.8125 | 0 |
| 0.8131944444444444 | 0 |
| 0.813888888888889 | 0 |
| 0.8145833333333333 | 0 |
| 0.8152777777777778 | 0 |
| 0.8159722222222222 | 0 |
| 0.8166666666666668 | 0 |
| 0.8173611111111111 | 0 |
| 0.8180555555555555 | 0 |
| 0.81875 | 0 |
| 0.8194444444444445 | 0 |
| 0.8201388888888889 | 0 |
| 0.8208333333333333 | 0 |
| 0.8215277777777777 | 0 |
| 0.8222222222222223 | 0 |
| 0.8229166666666666 | 0 |
| 0.8236111111111111 | 0 |
| 0.8243055555555556 | 0 |
| 0.8250000000000001 | 0 |
| 0.8256944444444444 | 0 |
| 0.8263888888888888 | 0 |
| 0.8270833333333334 | 0 |
| 0.8277777777777778 | 0 |
| 0.8284722222222222 | 0 |
| 0.8291666666666666 | 0 |
| 0.8298611111111112 | 0 |
| 0.8305555555555556 | 0 |
| 0.8312499999999999 | 0 |
| 0.8319444444444444 | 0 |
| 0.8326388888888889 | 0 |
| 0.8333333333333334 | 0 |
| 0.8340277777777777 | 0 |
| 0.8347222222222223 | 0 |
| 0.8354166666666667 | 0 |
| 0.8361111111111111 | 0 |
| 0.8368055555555555 | 0 |
| 0.8375 | 0 |
| 0.8381944444444445 | 0 |
| 0.8388888888888889 | 0 |
| 0.8395833333333332 | 0 |
| 0.8402777777777778 | 0 |
| 0.8409722222222222 | 0 |
| 0.8416666666666667 | 0 |
| 0.842361111111111 | 0 |
| 0.8430555555555556 | 0 |
| 0.84375 | 0 |
| 0.8444444444444444 | 0 |
| 0.845138888888889 | 0 |
| 0.8458333333333333 | 0 |
| 0.8465277777777778 | 0 |
| 0.8472222222222222 | 0 |
| 0.8479166666666668 | 0 |
| 0.8486111111111111 | 0 |
| 0.8493055555555555 | 0 |
| 0.85 | 0 |
| 0.8506944444444445 | 0 |
| 0.8513888888888889 | 0 |
| 0.8520833333333333 | 0 |
| 0.8527777777777777 | 0 |
| 0.8534722222222223 | 0 |
| 0.8541666666666666 | 0 |
| 0.8548611111111111 | 0 |
| 0.8555555555555556 | 0 |
| 0.8562500000000001 | 0 |
| 0.8569444444444444 | 0 |
| 0.8576388888888888 | 0 |
| 0.8583333333333334 | 0 |
| 0.8590277777777778 | 0 |
| 0.8597222222222222 | 0 |
| 0.8604166666666666 | 0 |
| 0.8611111111111112 | 0 |
| 0.8618055555555556 | 0 |
| 0.8624999999999999 | 0 |
| 0.8631944444444444 | 0 |
| 0.8638888888888889 | 0 |
| 0.8645833333333334 | 0 |
| 0.8652777777777777 | 0 |
| 0.8659722222222223 | 0 |
| 0.8666666666666667 | 0 |
| 0.8673611111111111 | 0 |
| 0.8680555555555555 | 0 |
| 0.86875 | 0 |
| 0.8694444444444445 | 0 |
| 0.8701388888888889 | 0 |
| 0.8708333333333332 | 0 |
| 0.8715277777777778 | 0 |
| 0.8722222222222222 | 0 |
| 0.8729166666666667 | 0 |
| 0.873611111111111 | 0 |
| 0.8743055555555556 | 0 |
| 0.875 | 0 |
| 0.8756944444444444 | 0 |
| 0.876388888888889 | 0 |
| 0.8770833333333333 | 0 |
| 0.8777777777777778 | 0 |
| 0.8784722222222222 | 0 |
| 0.8791666666666668 | 0 |
| 0.8798611111111111 | 0 |
| 0.8805555555555555 | 0 |
| 0.88125 | 0 |
| 0.8819444444444445 | 0 |
| 0.8826388888888889 | 0 |
| 0.8833333333333333 | 0 |
| 0.8840277777777777 | 0 |
| 0.8847222222222223 | 0 |
| 0.8854166666666666 | 0 |
| 0.8861111111111111 | 0 |
| 0.8868055555555556 | 0 |
| 0.8875000000000001 | 0 |
| 0.8881944444444444 | 0 |
| 0.8888888888888888 | 0 |
| 0.8895833333333334 | 0 |
| 0.8902777777777778 | 0 |
| 0.8909722222222222 | 0 |
| 0.8916666666666666 | 0 |
| 0.8923611111111112 | 0 |
| 0.8930555555555556 | 0 |
| 0.8937499999999999 | 0 |
| 0.8944444444444444 | 0 |
| 0.8951388888888889 | 0 |
| 0.8958333333333334 | 0 |
| 0.8965277777777777 | 0 |
| 0.8972222222222223 | 0 |
| 0.8979166666666667 | 0 |
| 0.8986111111111111 | 0 |
| 0.8993055555555555 | 0 |
| 0.9 | 0 |
| 0.9006944444444445 | 0 |
| 0.9013888888888889 | 0 |
| 0.9020833333333332 | 0 |
| 0.9027777777777778 | 0 |
| 0.9034722222222222 | 0 |
| 0.9041666666666667 | 0 |
| 0.904861111111111 | 0 |
| 0.9055555555555556 | 0 |
| 0.90625 | 0 |
| 0.9069444444444444 | 0 |
| 0.907638888888889 | 0 |
| 0.9083333333333333 | 0 |
| 0.9090277777777778 | 0 |
| 0.9097222222222222 | 0 |
| 0.9104166666666668 | 0 |
| 0.9111111111111111 | 0 |
| 0.9118055555555555 | 0 |
| 0.9125 | 0 |
| 0.9131944444444445 | 0 |
| 0.9138888888888889 | 0 |
| 0.9145833333333333 | 0 |
| 0.9152777777777777 | 0 |
| 0.9159722222222223 | 0 |
| 0.9166666666666666 | 0 |
| 0.9173611111111111 | 0 |
| 0.9180555555555556 | 0 |
| 0.9187500000000001 | 0 |
| 0.9194444444444444 | 0 |
| 0.9201388888888888 | 0 |
| 0.9208333333333334 | 0 |
| 0.9215277777777778 | 0 |
| 0.9222222222222222 | 0 |
| 0.9229166666666666 | 0 |
| 0.9236111111111112 | 0 |
| 0.9243055555555556 | 0 |
| 0.9249999999999999 | 0 |
| 0.9256944444444444 | 0 |
| 0.9263888888888889 | 0 |
| 0.9270833333333334 | 0 |
| 0.9277777777777777 | 0 |
| 0.9284722222222223 | 0 |
| 0.9291666666666667 | 0 |
| 0.9298611111111111 | 0 |
| 0.9305555555555555 | 0 |
| 0.93125 | 0 |
| 0.9319444444444445 | 0 |
| 0.9326388888888889 | 0 |
| 0.9333333333333332 | 0 |
| 0.9340277777777778 | 0 |
| 0.9347222222222222 | 0 |
| 0.9354166666666667 | 0 |
| 0.936111111111111 | 0 |
| 0.9368055555555556 | 0 |
| 0.9375 | 0 |
| 0.9381944444444444 | 0 |
| 0.938888888888889 | 0 |
| 0.9395833333333333 | 0 |
| 0.9402777777777778 | 0 |
| 0.9409722222222222 | 0 |
| 0.9416666666666668 | 0 |
| 0.9423611111111111 | 0 |
| 0.9430555555555555 | 0 |
| 0.94375 | 0 |
| 0.9444444444444445 | 0 |
| 0.9451388888888889 | 0 |
| 0.9458333333333333 | 0 |
| 0.9465277777777777 | 0 |
| 0.9472222222222223 | 0 |
| 0.9479166666666666 | 0 |
| 0.9486111111111111 | 0 |
| 0.9493055555555556 | 0 |
| 0.9500000000000001 | 0 |
| 0.9506944444444444 | 0 |
| 0.9513888888888888 | 0 |
| 0.9520833333333334 | 0 |
| 0.9527777777777778 | 0 |
| 0.9534722222222222 | 0 |
| 0.9541666666666666 | 0 |
| 0.9548611111111112 | 0 |
| 0.9555555555555556 | 0 |
| 0.9562499999999999 | 0 |
| 0.9569444444444444 | 0 |
| 0.9576388888888889 | 0 |
| 0.9583333333333334 | 0 |
| 0.9590277777777777 | 0 |
| 0.9597222222222223 | 0 |
| 0.9604166666666667 | 0 |
| 0.9611111111111111 | 0 |
| 0.9618055555555555 | 0 |
| 0.9625 | 0 |
| 0.9631944444444445 | 0 |
| 0.9638888888888889 | 0 |
| 0.9645833333333332 | 0 |
| 0.9652777777777778 | 0 |
| 0.9659722222222222 | 0 |
| 0.9666666666666667 | 0 |
| 0.967361111111111 | 0 |
| 0.9680555555555556 | 0 |
| 0.96875 | 0 |
| 0.9694444444444444 | 0 |
| 0.970138888888889 | 0 |
| 0.9708333333333333 | 0 |
| 0.9715277777777778 | 0 |
| 0.9722222222222222 | 0 |
| 0.9729166666666668 | 0 |
| 0.9736111111111111 | 0 |
| 0.9743055555555555 | 0 |
| 0.975 | 0 |
| 0.9756944444444445 | 0 |
| 0.9763888888888889 | 0 |
| 0.9770833333333333 | 0 |
| 0.9777777777777777 | 0 |
| 0.9784722222222223 | 0 |
| 0.9791666666666666 | 0 |
| 0.9798611111111111 | 0 |
| 0.9805555555555556 | 0 |
| 0.9812500000000001 | 0 |
| 0.9819444444444444 | 0 |
| 0.9826388888888888 | 0 |
| 0.9833333333333334 | 0 |
| 0.9840277777777778 | 0 |
| 0.9847222222222222 | 0 |
| 0.9854166666666666 | 0 |
| 0.9861111111111112 | 0 |
| 0.9868055555555556 | 0 |
| 0.9874999999999999 | 0 |
| 0.9881944444444444 | 0 |
| 0.9888888888888889 | 0 |
| 0.9895833333333334 | 0 |
| 0.9902777777777777 | 0 |
| 0.9909722222222223 | 0 |
| 0.9916666666666667 | 0 |
| 0.9923611111111111 | 0 |
| 0.9930555555555555 | 0 |
| 0.99375 | 0 |
| 0.9944444444444445 | 0 |
| 0.9951388888888889 | 0 |
| 0.9958333333333332 | 0 |
| 0.9965277777777778 | 0 |
| 0.9972222222222222 | 0 |
| 0.9979166666666667 | 0 |
| 0.998611111111111 | 0 |
| 0.9993055555555556 | 0 |